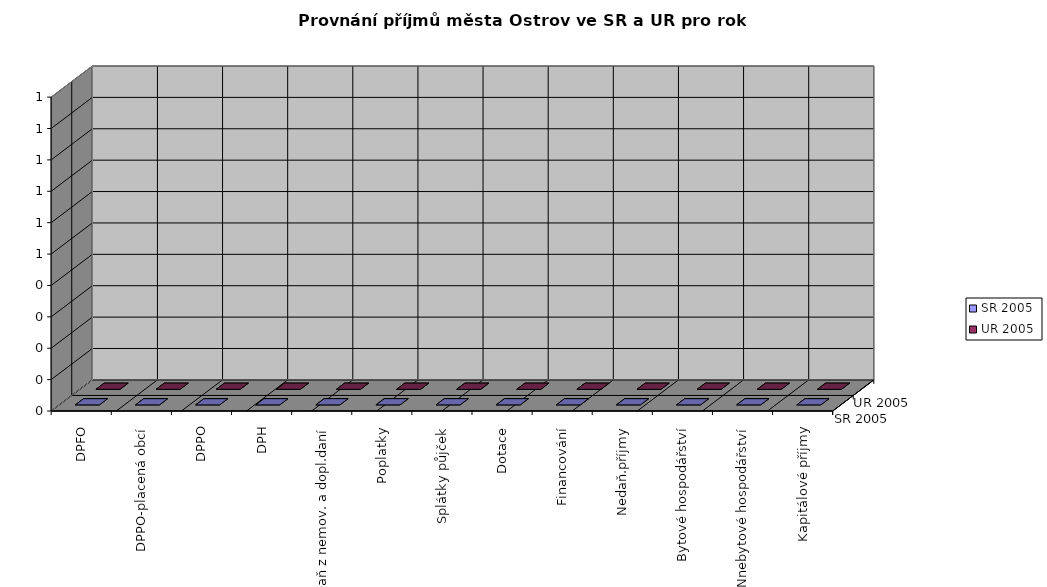
| Category | SR 2005 | UR 2005 |
|---|---|---|
| DPFO | 0 | 0 |
| DPPO-placená obcí | 0 | 0 |
| DPPO | 0 | 0 |
| DPH | 0 | 0 |
| Daň z nemov. a dopl.daní | 0 | 0 |
| Poplatky | 0 | 0 |
| Splátky půjček | 0 | 0 |
| Dotace | 0 | 0 |
| Financování | 0 | 0 |
| Nedaň.příjmy | 0 | 0 |
| Bytové hospodářství | 0 | 0 |
| Nnebytové hospodářství | 0 | 0 |
| Kapitálové příjmy | 0 | 0 |